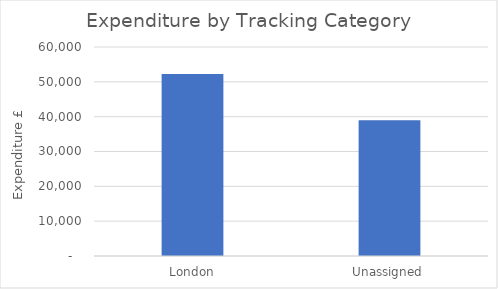
| Category | Total |
|---|---|
| London | 52220.9 |
| Unassigned | 38973.11 |